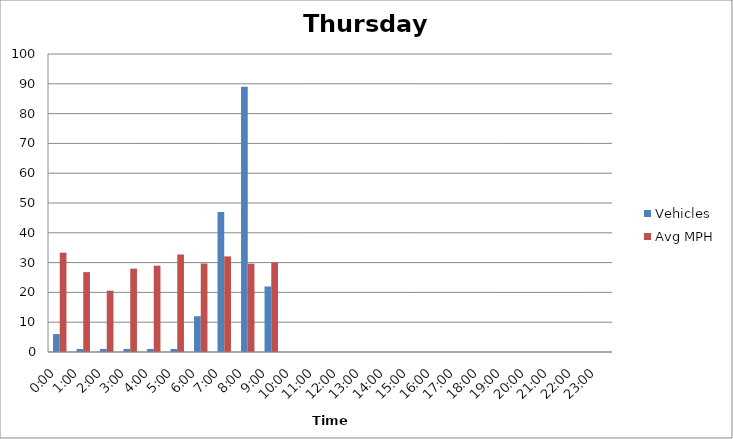
| Category | Vehicles | Avg MPH |
|---|---|---|
| 0:00 | 6 | 33.33 |
| 1:00 | 1 | 26.81 |
| 2:00 | 1 | 20.57 |
| 3:00 | 1 | 27.98 |
| 4:00 | 1 | 28.97 |
| 5:00 | 1 | 32.72 |
| 6:00 | 12 | 29.69 |
| 7:00 | 47 | 32.08 |
| 8:00 | 89 | 29.64 |
| 9:00 | 22 | 30.06 |
| 10:00 | 0 | 0 |
| 11:00 | 0 | 0 |
| 12:00 | 0 | 0 |
| 13:00 | 0 | 0 |
| 14:00 | 0 | 0 |
| 15:00 | 0 | 0 |
| 16:00 | 0 | 0 |
| 17:00 | 0 | 0 |
| 18:00 | 0 | 0 |
| 19:00 | 0 | 0 |
| 20:00 | 0 | 0 |
| 21:00 | 0 | 0 |
| 22:00 | 0 | 0 |
| 23:00 | 0 | 0 |